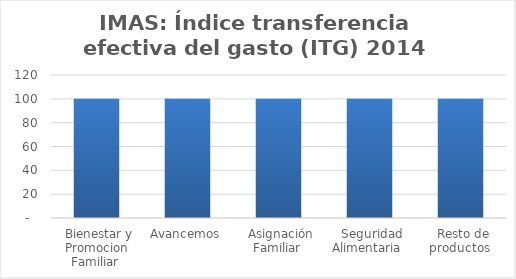
| Category | Índice transferencia efectiva del gasto (ITG) |
|---|---|
| Bienestar y Promocion Familiar | 100 |
| Avancemos | 100 |
| Asignación Familiar | 100 |
| Seguridad Alimentaria | 100 |
| Resto de productos | 100 |